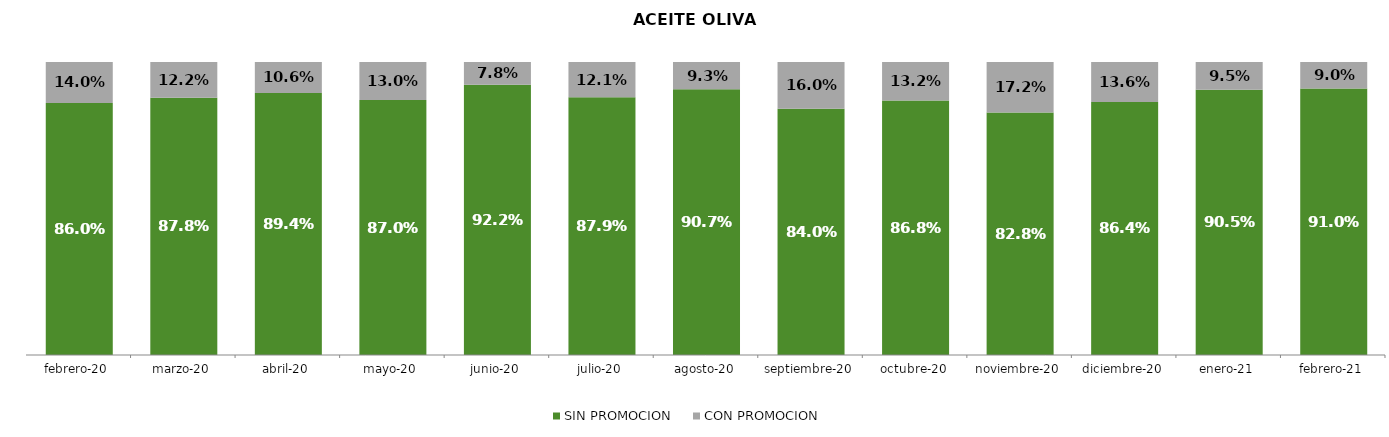
| Category | SIN PROMOCION   | CON PROMOCION   |
|---|---|---|
| 2020-02-01 | 0.86 | 0.14 |
| 2020-03-01 | 0.878 | 0.122 |
| 2020-04-01 | 0.894 | 0.106 |
| 2020-05-01 | 0.87 | 0.13 |
| 2020-06-01 | 0.922 | 0.078 |
| 2020-07-01 | 0.879 | 0.121 |
| 2020-08-01 | 0.907 | 0.093 |
| 2020-09-01 | 0.84 | 0.16 |
| 2020-10-01 | 0.868 | 0.132 |
| 2020-11-01 | 0.828 | 0.172 |
| 2020-12-01 | 0.864 | 0.136 |
| 2021-01-01 | 0.905 | 0.095 |
| 2021-02-01 | 0.91 | 0.09 |